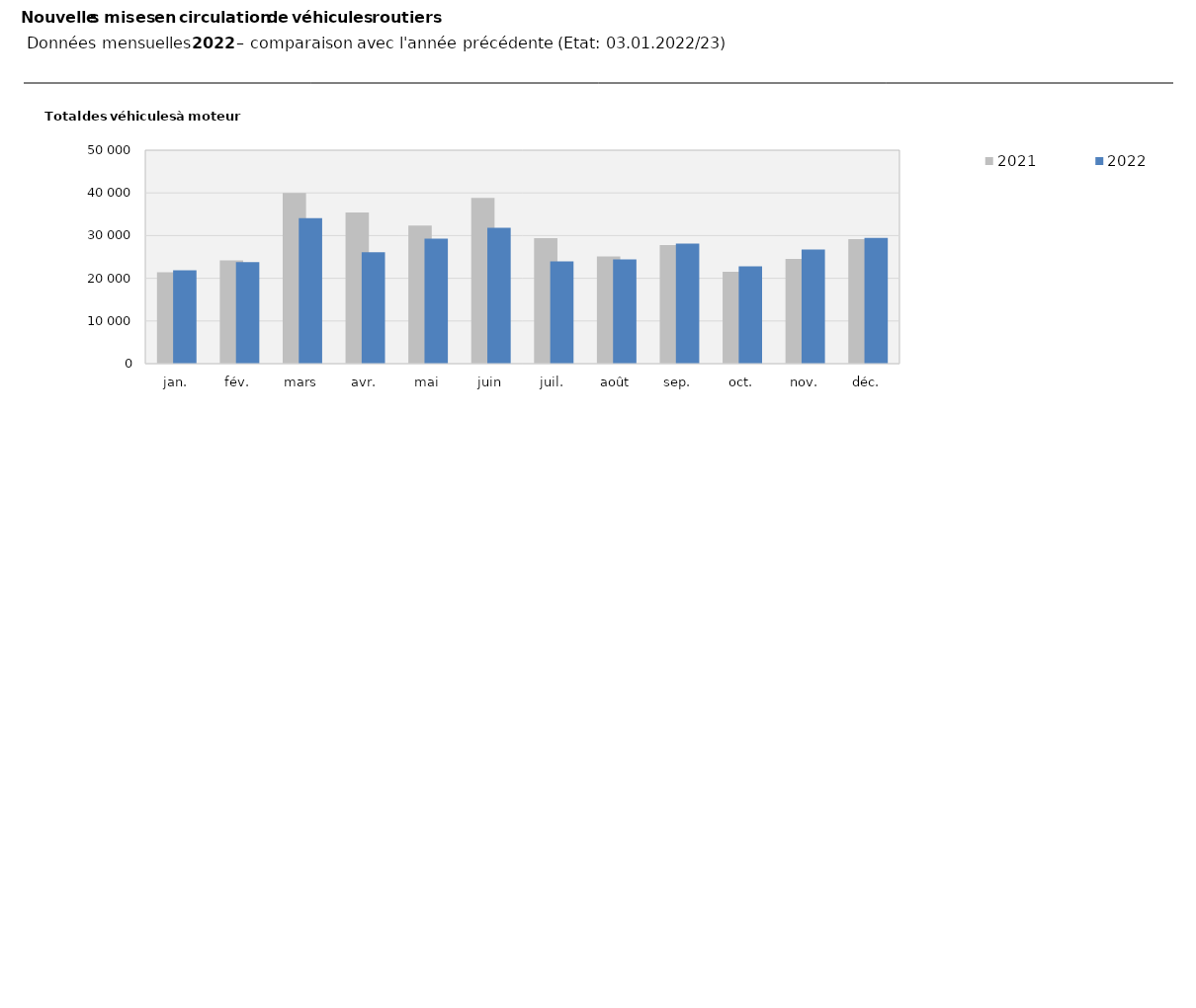
| Category | 2021 | 2022 |
|---|---|---|
| jan. | 21417 | 21866 |
| fév. | 24177 | 23784 |
| mars | 40000 | 34075 |
| avr. | 35400 | 26079 |
| mai | 32326 | 29254 |
| juin | 38853 | 31810 |
| juil. | 29414 | 23983 |
| août | 25107 | 24433 |
| sep. | 27750 | 28123 |
| oct. | 21528 | 22806 |
| nov. | 24537 | 26724 |
| déc. | 29156 | 29450 |